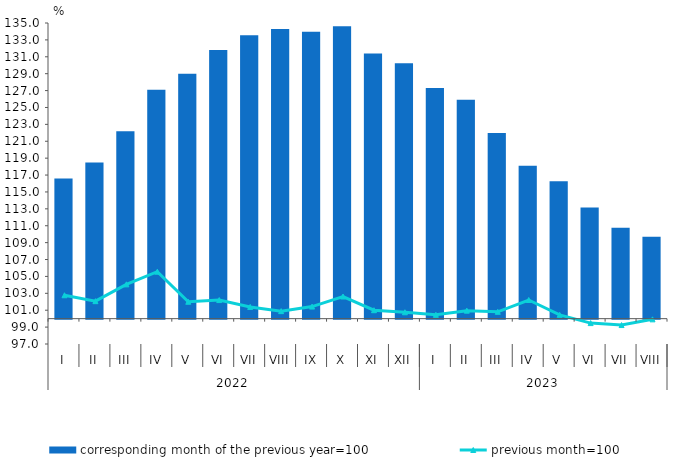
| Category | corresponding month of the previous year=100 |
|---|---|
| 0 | 116.6 |
| 1 | 118.5 |
| 2 | 122.2 |
| 3 | 127.1 |
| 4 | 129 |
| 5 | 131.8 |
| 6 | 133.55 |
| 7 | 134.29 |
| 8 | 133.97 |
| 9 | 134.62 |
| 10 | 131.4 |
| 11 | 130.24 |
| 12 | 127.307 |
| 13 | 125.905 |
| 14 | 121.977 |
| 15 | 118.102 |
| 16 | 116.262 |
| 17 | 113.152 |
| 18 | 110.755 |
| 19 | 109.689 |